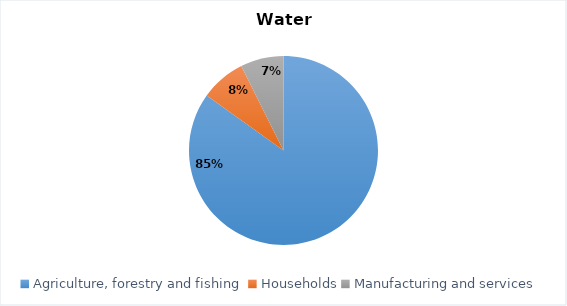
| Category | Series 1 |
|---|---|
| Agriculture, forestry and fishing | 673.352 |
| Households | 61.368 |
| Manufacturing and services | 58.443 |